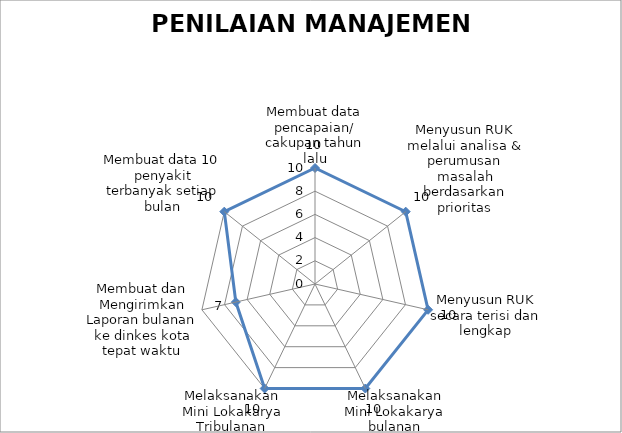
| Category | Series 0 |
|---|---|
| Membuat data pencapaian/ cakupan tahun lalu | 10 |
| Menyusun RUK melalui analisa & perumusan masalah berdasarkan prioritas | 10 |
| Menyusun RUK secara terisi dan lengkap | 10 |
| Melaksanakan Mini Lokakarya bulanan | 10 |
| Melaksanakan Mini Lokakarya Tribulanan (Lintas Sektoral) | 10 |
| Membuat dan Mengirimkan Laporan bulanan ke dinkes kota tepat waktu | 7 |
| Membuat data 10 penyakit terbanyak setiap bulan | 10 |